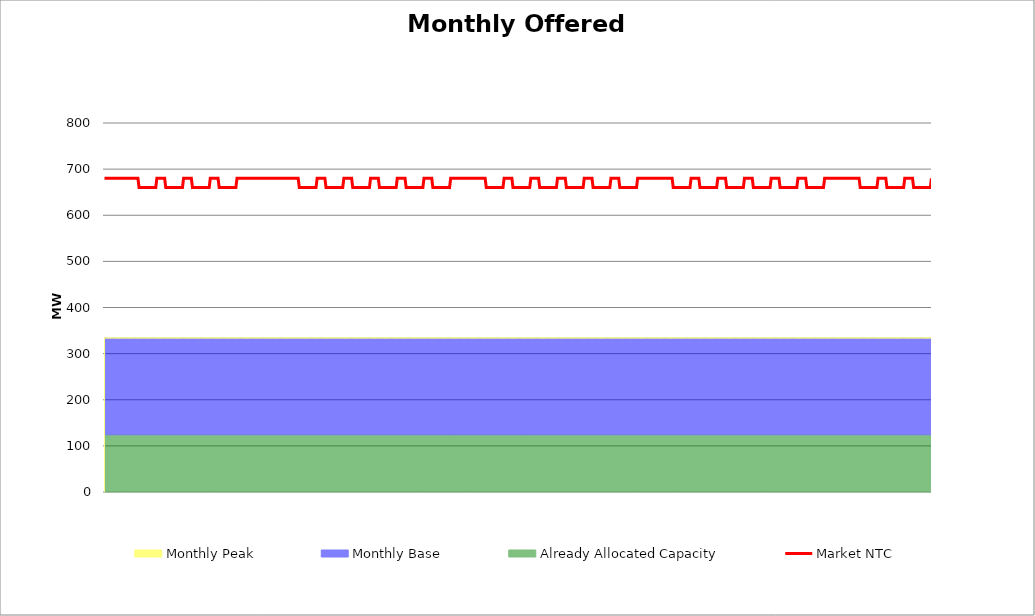
| Category | Market NTC |
|---|---|
| 0 | 680 |
| 1 | 680 |
| 2 | 680 |
| 3 | 680 |
| 4 | 680 |
| 5 | 680 |
| 6 | 680 |
| 7 | 680 |
| 8 | 680 |
| 9 | 680 |
| 10 | 680 |
| 11 | 680 |
| 12 | 680 |
| 13 | 680 |
| 14 | 680 |
| 15 | 680 |
| 16 | 680 |
| 17 | 680 |
| 18 | 680 |
| 19 | 680 |
| 20 | 680 |
| 21 | 680 |
| 22 | 680 |
| 23 | 680 |
| 24 | 680 |
| 25 | 680 |
| 26 | 680 |
| 27 | 680 |
| 28 | 680 |
| 29 | 680 |
| 30 | 680 |
| 31 | 660 |
| 32 | 660 |
| 33 | 660 |
| 34 | 660 |
| 35 | 660 |
| 36 | 660 |
| 37 | 660 |
| 38 | 660 |
| 39 | 660 |
| 40 | 660 |
| 41 | 660 |
| 42 | 660 |
| 43 | 660 |
| 44 | 660 |
| 45 | 660 |
| 46 | 660 |
| 47 | 680 |
| 48 | 680 |
| 49 | 680 |
| 50 | 680 |
| 51 | 680 |
| 52 | 680 |
| 53 | 680 |
| 54 | 680 |
| 55 | 660 |
| 56 | 660 |
| 57 | 660 |
| 58 | 660 |
| 59 | 660 |
| 60 | 660 |
| 61 | 660 |
| 62 | 660 |
| 63 | 660 |
| 64 | 660 |
| 65 | 660 |
| 66 | 660 |
| 67 | 660 |
| 68 | 660 |
| 69 | 660 |
| 70 | 660 |
| 71 | 680 |
| 72 | 680 |
| 73 | 680 |
| 74 | 680 |
| 75 | 680 |
| 76 | 680 |
| 77 | 680 |
| 78 | 680 |
| 79 | 660 |
| 80 | 660 |
| 81 | 660 |
| 82 | 660 |
| 83 | 660 |
| 84 | 660 |
| 85 | 660 |
| 86 | 660 |
| 87 | 660 |
| 88 | 660 |
| 89 | 660 |
| 90 | 660 |
| 91 | 660 |
| 92 | 660 |
| 93 | 660 |
| 94 | 660 |
| 95 | 680 |
| 96 | 680 |
| 97 | 680 |
| 98 | 680 |
| 99 | 680 |
| 100 | 680 |
| 101 | 680 |
| 102 | 680 |
| 103 | 660 |
| 104 | 660 |
| 105 | 660 |
| 106 | 660 |
| 107 | 660 |
| 108 | 660 |
| 109 | 660 |
| 110 | 660 |
| 111 | 660 |
| 112 | 660 |
| 113 | 660 |
| 114 | 660 |
| 115 | 660 |
| 116 | 660 |
| 117 | 660 |
| 118 | 660 |
| 119 | 680 |
| 120 | 680 |
| 121 | 680 |
| 122 | 680 |
| 123 | 680 |
| 124 | 680 |
| 125 | 680 |
| 126 | 680 |
| 127 | 680 |
| 128 | 680 |
| 129 | 680 |
| 130 | 680 |
| 131 | 680 |
| 132 | 680 |
| 133 | 680 |
| 134 | 680 |
| 135 | 680 |
| 136 | 680 |
| 137 | 680 |
| 138 | 680 |
| 139 | 680 |
| 140 | 680 |
| 141 | 680 |
| 142 | 680 |
| 143 | 680 |
| 144 | 680 |
| 145 | 680 |
| 146 | 680 |
| 147 | 680 |
| 148 | 680 |
| 149 | 680 |
| 150 | 680 |
| 151 | 680 |
| 152 | 680 |
| 153 | 680 |
| 154 | 680 |
| 155 | 680 |
| 156 | 680 |
| 157 | 680 |
| 158 | 680 |
| 159 | 680 |
| 160 | 680 |
| 161 | 680 |
| 162 | 680 |
| 163 | 680 |
| 164 | 680 |
| 165 | 680 |
| 166 | 680 |
| 167 | 680 |
| 168 | 680 |
| 169 | 680 |
| 170 | 680 |
| 171 | 680 |
| 172 | 680 |
| 173 | 680 |
| 174 | 680 |
| 175 | 660 |
| 176 | 660 |
| 177 | 660 |
| 178 | 660 |
| 179 | 660 |
| 180 | 660 |
| 181 | 660 |
| 182 | 660 |
| 183 | 660 |
| 184 | 660 |
| 185 | 660 |
| 186 | 660 |
| 187 | 660 |
| 188 | 660 |
| 189 | 660 |
| 190 | 660 |
| 191 | 680 |
| 192 | 680 |
| 193 | 680 |
| 194 | 680 |
| 195 | 680 |
| 196 | 680 |
| 197 | 680 |
| 198 | 680 |
| 199 | 660 |
| 200 | 660 |
| 201 | 660 |
| 202 | 660 |
| 203 | 660 |
| 204 | 660 |
| 205 | 660 |
| 206 | 660 |
| 207 | 660 |
| 208 | 660 |
| 209 | 660 |
| 210 | 660 |
| 211 | 660 |
| 212 | 660 |
| 213 | 660 |
| 214 | 660 |
| 215 | 680 |
| 216 | 680 |
| 217 | 680 |
| 218 | 680 |
| 219 | 680 |
| 220 | 680 |
| 221 | 680 |
| 222 | 680 |
| 223 | 660 |
| 224 | 660 |
| 225 | 660 |
| 226 | 660 |
| 227 | 660 |
| 228 | 660 |
| 229 | 660 |
| 230 | 660 |
| 231 | 660 |
| 232 | 660 |
| 233 | 660 |
| 234 | 660 |
| 235 | 660 |
| 236 | 660 |
| 237 | 660 |
| 238 | 660 |
| 239 | 680 |
| 240 | 680 |
| 241 | 680 |
| 242 | 680 |
| 243 | 680 |
| 244 | 680 |
| 245 | 680 |
| 246 | 680 |
| 247 | 660 |
| 248 | 660 |
| 249 | 660 |
| 250 | 660 |
| 251 | 660 |
| 252 | 660 |
| 253 | 660 |
| 254 | 660 |
| 255 | 660 |
| 256 | 660 |
| 257 | 660 |
| 258 | 660 |
| 259 | 660 |
| 260 | 660 |
| 261 | 660 |
| 262 | 660 |
| 263 | 680 |
| 264 | 680 |
| 265 | 680 |
| 266 | 680 |
| 267 | 680 |
| 268 | 680 |
| 269 | 680 |
| 270 | 680 |
| 271 | 660 |
| 272 | 660 |
| 273 | 660 |
| 274 | 660 |
| 275 | 660 |
| 276 | 660 |
| 277 | 660 |
| 278 | 660 |
| 279 | 660 |
| 280 | 660 |
| 281 | 660 |
| 282 | 660 |
| 283 | 660 |
| 284 | 660 |
| 285 | 660 |
| 286 | 660 |
| 287 | 680 |
| 288 | 680 |
| 289 | 680 |
| 290 | 680 |
| 291 | 680 |
| 292 | 680 |
| 293 | 680 |
| 294 | 680 |
| 295 | 660 |
| 296 | 660 |
| 297 | 660 |
| 298 | 660 |
| 299 | 660 |
| 300 | 660 |
| 301 | 660 |
| 302 | 660 |
| 303 | 660 |
| 304 | 660 |
| 305 | 660 |
| 306 | 660 |
| 307 | 660 |
| 308 | 660 |
| 309 | 660 |
| 310 | 660 |
| 311 | 680 |
| 312 | 680 |
| 313 | 680 |
| 314 | 680 |
| 315 | 680 |
| 316 | 680 |
| 317 | 680 |
| 318 | 680 |
| 319 | 680 |
| 320 | 680 |
| 321 | 680 |
| 322 | 680 |
| 323 | 680 |
| 324 | 680 |
| 325 | 680 |
| 326 | 680 |
| 327 | 680 |
| 328 | 680 |
| 329 | 680 |
| 330 | 680 |
| 331 | 680 |
| 332 | 680 |
| 333 | 680 |
| 334 | 680 |
| 335 | 680 |
| 336 | 680 |
| 337 | 680 |
| 338 | 680 |
| 339 | 680 |
| 340 | 680 |
| 341 | 680 |
| 342 | 680 |
| 343 | 660 |
| 344 | 660 |
| 345 | 660 |
| 346 | 660 |
| 347 | 660 |
| 348 | 660 |
| 349 | 660 |
| 350 | 660 |
| 351 | 660 |
| 352 | 660 |
| 353 | 660 |
| 354 | 660 |
| 355 | 660 |
| 356 | 660 |
| 357 | 660 |
| 358 | 660 |
| 359 | 680 |
| 360 | 680 |
| 361 | 680 |
| 362 | 680 |
| 363 | 680 |
| 364 | 680 |
| 365 | 680 |
| 366 | 680 |
| 367 | 660 |
| 368 | 660 |
| 369 | 660 |
| 370 | 660 |
| 371 | 660 |
| 372 | 660 |
| 373 | 660 |
| 374 | 660 |
| 375 | 660 |
| 376 | 660 |
| 377 | 660 |
| 378 | 660 |
| 379 | 660 |
| 380 | 660 |
| 381 | 660 |
| 382 | 660 |
| 383 | 680 |
| 384 | 680 |
| 385 | 680 |
| 386 | 680 |
| 387 | 680 |
| 388 | 680 |
| 389 | 680 |
| 390 | 680 |
| 391 | 660 |
| 392 | 660 |
| 393 | 660 |
| 394 | 660 |
| 395 | 660 |
| 396 | 660 |
| 397 | 660 |
| 398 | 660 |
| 399 | 660 |
| 400 | 660 |
| 401 | 660 |
| 402 | 660 |
| 403 | 660 |
| 404 | 660 |
| 405 | 660 |
| 406 | 660 |
| 407 | 680 |
| 408 | 680 |
| 409 | 680 |
| 410 | 680 |
| 411 | 680 |
| 412 | 680 |
| 413 | 680 |
| 414 | 680 |
| 415 | 660 |
| 416 | 660 |
| 417 | 660 |
| 418 | 660 |
| 419 | 660 |
| 420 | 660 |
| 421 | 660 |
| 422 | 660 |
| 423 | 660 |
| 424 | 660 |
| 425 | 660 |
| 426 | 660 |
| 427 | 660 |
| 428 | 660 |
| 429 | 660 |
| 430 | 660 |
| 431 | 680 |
| 432 | 680 |
| 433 | 680 |
| 434 | 680 |
| 435 | 680 |
| 436 | 680 |
| 437 | 680 |
| 438 | 680 |
| 439 | 660 |
| 440 | 660 |
| 441 | 660 |
| 442 | 660 |
| 443 | 660 |
| 444 | 660 |
| 445 | 660 |
| 446 | 660 |
| 447 | 660 |
| 448 | 660 |
| 449 | 660 |
| 450 | 660 |
| 451 | 660 |
| 452 | 660 |
| 453 | 660 |
| 454 | 660 |
| 455 | 680 |
| 456 | 680 |
| 457 | 680 |
| 458 | 680 |
| 459 | 680 |
| 460 | 680 |
| 461 | 680 |
| 462 | 680 |
| 463 | 660 |
| 464 | 660 |
| 465 | 660 |
| 466 | 660 |
| 467 | 660 |
| 468 | 660 |
| 469 | 660 |
| 470 | 660 |
| 471 | 660 |
| 472 | 660 |
| 473 | 660 |
| 474 | 660 |
| 475 | 660 |
| 476 | 660 |
| 477 | 660 |
| 478 | 660 |
| 479 | 680 |
| 480 | 680 |
| 481 | 680 |
| 482 | 680 |
| 483 | 680 |
| 484 | 680 |
| 485 | 680 |
| 486 | 680 |
| 487 | 680 |
| 488 | 680 |
| 489 | 680 |
| 490 | 680 |
| 491 | 680 |
| 492 | 680 |
| 493 | 680 |
| 494 | 680 |
| 495 | 680 |
| 496 | 680 |
| 497 | 680 |
| 498 | 680 |
| 499 | 680 |
| 500 | 680 |
| 501 | 680 |
| 502 | 680 |
| 503 | 680 |
| 504 | 680 |
| 505 | 680 |
| 506 | 680 |
| 507 | 680 |
| 508 | 680 |
| 509 | 680 |
| 510 | 680 |
| 511 | 660 |
| 512 | 660 |
| 513 | 660 |
| 514 | 660 |
| 515 | 660 |
| 516 | 660 |
| 517 | 660 |
| 518 | 660 |
| 519 | 660 |
| 520 | 660 |
| 521 | 660 |
| 522 | 660 |
| 523 | 660 |
| 524 | 660 |
| 525 | 660 |
| 526 | 660 |
| 527 | 680 |
| 528 | 680 |
| 529 | 680 |
| 530 | 680 |
| 531 | 680 |
| 532 | 680 |
| 533 | 680 |
| 534 | 680 |
| 535 | 660 |
| 536 | 660 |
| 537 | 660 |
| 538 | 660 |
| 539 | 660 |
| 540 | 660 |
| 541 | 660 |
| 542 | 660 |
| 543 | 660 |
| 544 | 660 |
| 545 | 660 |
| 546 | 660 |
| 547 | 660 |
| 548 | 660 |
| 549 | 660 |
| 550 | 660 |
| 551 | 680 |
| 552 | 680 |
| 553 | 680 |
| 554 | 680 |
| 555 | 680 |
| 556 | 680 |
| 557 | 680 |
| 558 | 680 |
| 559 | 660 |
| 560 | 660 |
| 561 | 660 |
| 562 | 660 |
| 563 | 660 |
| 564 | 660 |
| 565 | 660 |
| 566 | 660 |
| 567 | 660 |
| 568 | 660 |
| 569 | 660 |
| 570 | 660 |
| 571 | 660 |
| 572 | 660 |
| 573 | 660 |
| 574 | 660 |
| 575 | 680 |
| 576 | 680 |
| 577 | 680 |
| 578 | 680 |
| 579 | 680 |
| 580 | 680 |
| 581 | 680 |
| 582 | 680 |
| 583 | 660 |
| 584 | 660 |
| 585 | 660 |
| 586 | 660 |
| 587 | 660 |
| 588 | 660 |
| 589 | 660 |
| 590 | 660 |
| 591 | 660 |
| 592 | 660 |
| 593 | 660 |
| 594 | 660 |
| 595 | 660 |
| 596 | 660 |
| 597 | 660 |
| 598 | 660 |
| 599 | 680 |
| 600 | 680 |
| 601 | 680 |
| 602 | 680 |
| 603 | 680 |
| 604 | 680 |
| 605 | 680 |
| 606 | 680 |
| 607 | 660 |
| 608 | 660 |
| 609 | 660 |
| 610 | 660 |
| 611 | 660 |
| 612 | 660 |
| 613 | 660 |
| 614 | 660 |
| 615 | 660 |
| 616 | 660 |
| 617 | 660 |
| 618 | 660 |
| 619 | 660 |
| 620 | 660 |
| 621 | 660 |
| 622 | 660 |
| 623 | 680 |
| 624 | 680 |
| 625 | 680 |
| 626 | 680 |
| 627 | 680 |
| 628 | 680 |
| 629 | 680 |
| 630 | 680 |
| 631 | 660 |
| 632 | 660 |
| 633 | 660 |
| 634 | 660 |
| 635 | 660 |
| 636 | 660 |
| 637 | 660 |
| 638 | 660 |
| 639 | 660 |
| 640 | 660 |
| 641 | 660 |
| 642 | 660 |
| 643 | 660 |
| 644 | 660 |
| 645 | 660 |
| 646 | 660 |
| 647 | 680 |
| 648 | 680 |
| 649 | 680 |
| 650 | 680 |
| 651 | 680 |
| 652 | 680 |
| 653 | 680 |
| 654 | 680 |
| 655 | 680 |
| 656 | 680 |
| 657 | 680 |
| 658 | 680 |
| 659 | 680 |
| 660 | 680 |
| 661 | 680 |
| 662 | 680 |
| 663 | 680 |
| 664 | 680 |
| 665 | 680 |
| 666 | 680 |
| 667 | 680 |
| 668 | 680 |
| 669 | 680 |
| 670 | 680 |
| 671 | 680 |
| 672 | 680 |
| 673 | 680 |
| 674 | 680 |
| 675 | 680 |
| 676 | 680 |
| 677 | 680 |
| 678 | 680 |
| 679 | 660 |
| 680 | 660 |
| 681 | 660 |
| 682 | 660 |
| 683 | 660 |
| 684 | 660 |
| 685 | 660 |
| 686 | 660 |
| 687 | 660 |
| 688 | 660 |
| 689 | 660 |
| 690 | 660 |
| 691 | 660 |
| 692 | 660 |
| 693 | 660 |
| 694 | 660 |
| 695 | 680 |
| 696 | 680 |
| 697 | 680 |
| 698 | 680 |
| 699 | 680 |
| 700 | 680 |
| 701 | 680 |
| 702 | 680 |
| 703 | 660 |
| 704 | 660 |
| 705 | 660 |
| 706 | 660 |
| 707 | 660 |
| 708 | 660 |
| 709 | 660 |
| 710 | 660 |
| 711 | 660 |
| 712 | 660 |
| 713 | 660 |
| 714 | 660 |
| 715 | 660 |
| 716 | 660 |
| 717 | 660 |
| 718 | 660 |
| 719 | 680 |
| 720 | 680 |
| 721 | 680 |
| 722 | 680 |
| 723 | 680 |
| 724 | 680 |
| 725 | 680 |
| 726 | 680 |
| 727 | 660 |
| 728 | 660 |
| 729 | 660 |
| 730 | 660 |
| 731 | 660 |
| 732 | 660 |
| 733 | 660 |
| 734 | 660 |
| 735 | 660 |
| 736 | 660 |
| 737 | 660 |
| 738 | 660 |
| 739 | 660 |
| 740 | 660 |
| 741 | 660 |
| 742 | 660 |
| 743 | 680 |